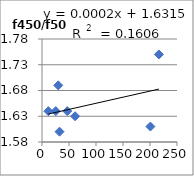
| Category | f450/f500 |
|---|---|
| 25.5 | 1.64 |
| 61.3 | 1.63 |
| 11.7 | 1.64 |
| 216.5 | 1.75 |
| 46.8 | 1.64 |
| 32.5 | 1.6 |
| 200.8 | 1.61 |
| 30.1 | 1.69 |